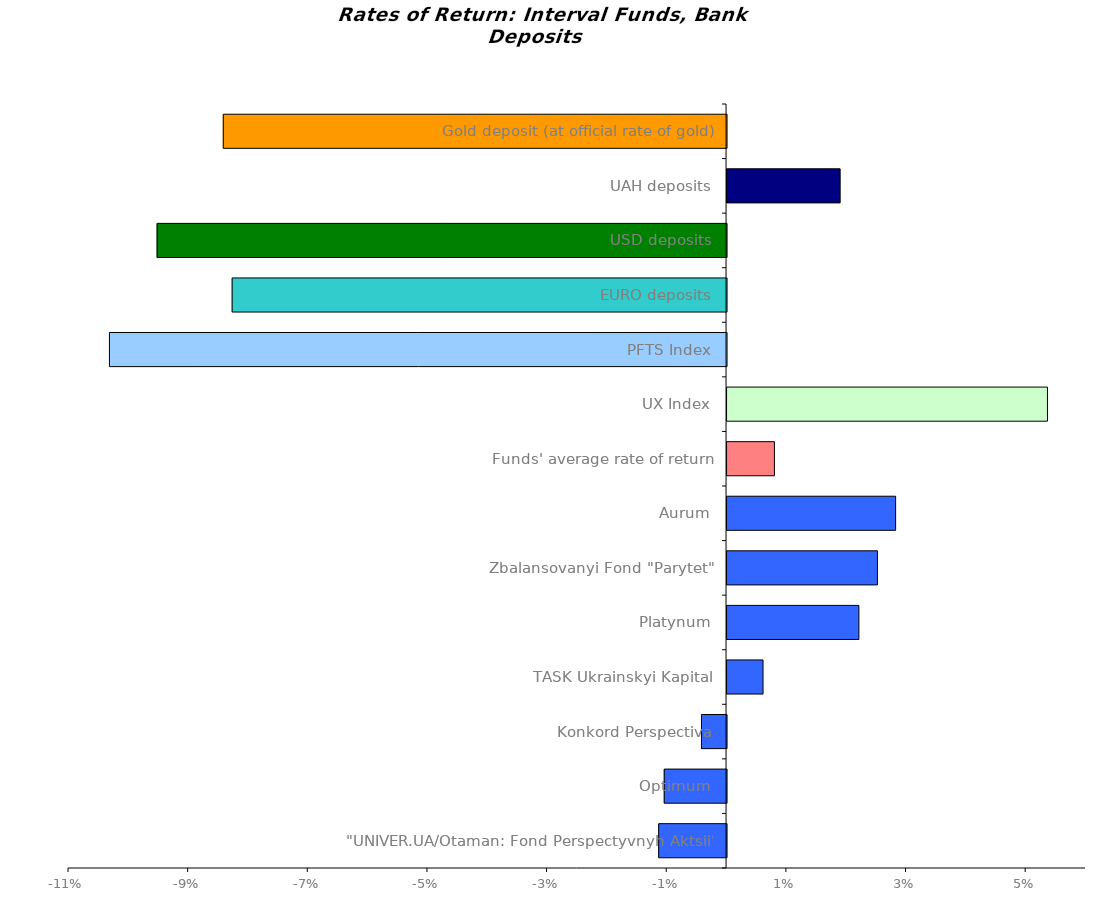
| Category | Series 0 |
|---|---|
| "UNIVER.UA/Otaman: Fond Perspectyvnyh Aktsii" | -0.011 |
| Optimum | -0.01 |
| Konkord Perspectiva | -0.004 |
| TASK Ukrainskyi Kapital | 0.006 |
| Platynum | 0.022 |
| Zbalansovanyi Fond "Parytet" | 0.025 |
| Aurum | 0.028 |
| Funds' average rate of return | 0.008 |
| UX Index | 0.054 |
| PFTS Index | -0.103 |
| EURO deposits | -0.083 |
| USD deposits | -0.095 |
| UAH deposits | 0.019 |
| Gold deposit (at official rate of gold) | -0.084 |